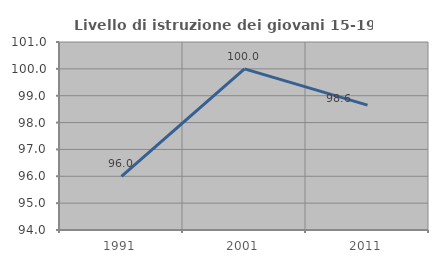
| Category | Livello di istruzione dei giovani 15-19 anni |
|---|---|
| 1991.0 | 96 |
| 2001.0 | 100 |
| 2011.0 | 98.649 |